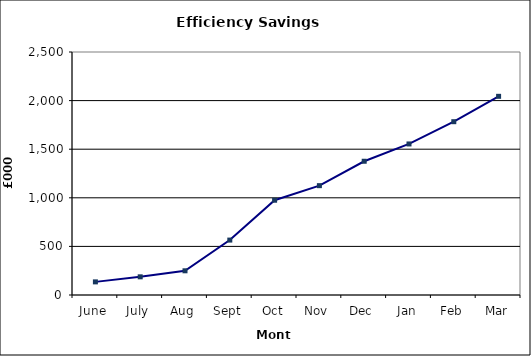
| Category | Series 0 |
|---|---|
| June | 135 |
| July | 187 |
| Aug | 249 |
| Sept | 565 |
| Oct | 975 |
| Nov | 1125 |
| Dec | 1376 |
| Jan | 1554 |
| Feb | 1783 |
| Mar | 2044 |